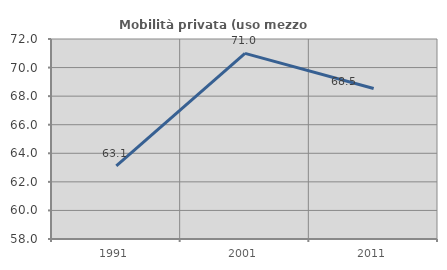
| Category | Mobilità privata (uso mezzo privato) |
|---|---|
| 1991.0 | 63.123 |
| 2001.0 | 70.997 |
| 2011.0 | 68.539 |